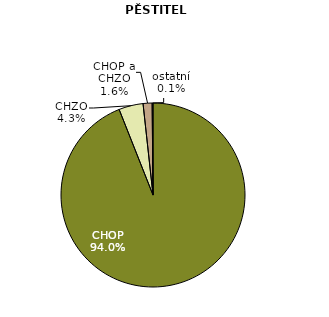
| Category | PĚSTITELÉ |
|---|---|
| CHOP | 94 |
| CHZO | 4.271 |
| CHOP a CHZO | 1.581 |
| ostatní | 0.148 |